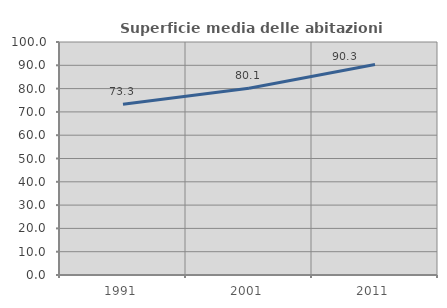
| Category | Superficie media delle abitazioni occupate |
|---|---|
| 1991.0 | 73.28 |
| 2001.0 | 80.121 |
| 2011.0 | 90.328 |